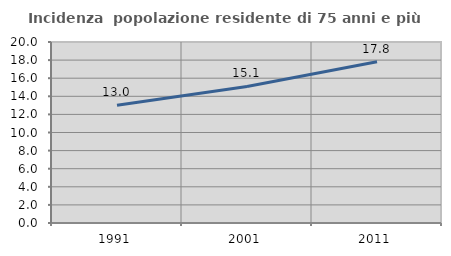
| Category | Incidenza  popolazione residente di 75 anni e più |
|---|---|
| 1991.0 | 13.001 |
| 2001.0 | 15.092 |
| 2011.0 | 17.81 |